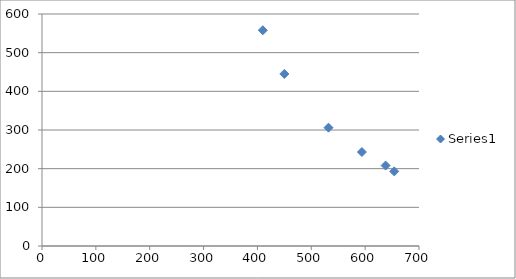
| Category | Series 0 |
|---|---|
| 410.0 | 558 |
| 450.0 | 445 |
| 532.0 | 306 |
| 594.0 | 243 |
| 638.0 | 208 |
| 654.0 | 193 |